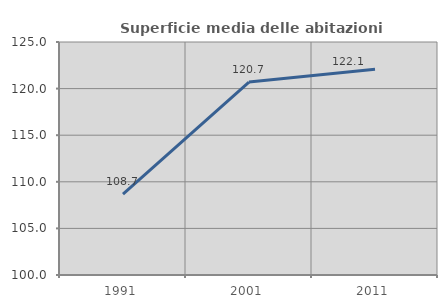
| Category | Superficie media delle abitazioni occupate |
|---|---|
| 1991.0 | 108.679 |
| 2001.0 | 120.706 |
| 2011.0 | 122.073 |